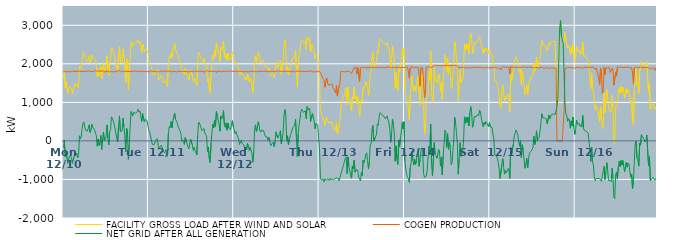
| Category | FACILITY GROSS LOAD AFTER WIND AND SOLAR | COGEN PRODUCTION | NET GRID AFTER ALL GENERATION |
|---|---|---|---|
|  Mon  12/10 | 1628 | 1807 | -179 |
|  Mon  12/10 | 1818 | 1796 | 22 |
|  Mon  12/10 | 1380 | 1792 | -412 |
|  Mon  12/10 | 1535 | 1798 | -263 |
|  Mon  12/10 | 1349 | 1794 | -445 |
|  Mon  12/10 | 1240 | 1818 | -578 |
|  Mon  12/10 | 1349 | 1804 | -455 |
|  Mon  12/10 | 1418 | 1812 | -394 |
|  Mon  12/10 | 1403 | 1790 | -387 |
|  Mon  12/10 | 1376 | 1804 | -428 |
|  Mon  12/10 | 1230 | 1812 | -582 |
|  Mon  12/10 | 1241 | 1806 | -565 |
|  Mon  12/10 | 1400 | 1801 | -401 |
|  Mon  12/10 | 1485 | 1807 | -322 |
|  Mon  12/10 | 1428 | 1800 | -372 |
|  Mon  12/10 | 1485 | 1802 | -317 |
|  Mon  12/10 | 1369 | 1812 | -443 |
|  Mon  12/10 | 1431 | 1811 | -380 |
|  Mon  12/10 | 1942 | 1809 | 133 |
|  Mon  12/10 | 1867 | 1814 | 53 |
|  Mon  12/10 | 1896 | 1800 | 96 |
|  Mon  12/10 | 2131 | 1810 | 321 |
|  Mon  12/10 | 2269 | 1806 | 463 |
|  Mon  12/10 | 2300 | 1807 | 493 |
|  Mon  12/10 | 2156 | 1799 | 357 |
|  Mon  12/10 | 2071 | 1798 | 273 |
|  Mon  12/10 | 2091 | 1812 | 279 |
|  Mon  12/10 | 2061 | 1805 | 256 |
|  Mon  12/10 | 2063 | 1812 | 251 |
|  Mon  12/10 | 2216 | 1799 | 417 |
|  Mon  12/10 | 2024 | 1806 | 218 |
|  Mon  12/10 | 2078 | 1810 | 268 |
|  Mon  12/10 | 2233 | 1805 | 428 |
|  Mon  12/10 | 2163 | 1809 | 354 |
|  Mon  12/10 | 2142 | 1796 | 346 |
|  Mon  12/10 | 2109 | 1823 | 286 |
|  Mon  12/10 | 2077 | 1807 | 270 |
|  Mon  12/10 | 1942 | 1811 | 131 |
|  Mon  12/10 | 1665 | 1801 | -136 |
|  Mon  12/10 | 1855 | 1807 | 48 |
|  Mon  12/10 | 1688 | 1802 | -114 |
|  Mon  12/10 | 1771 | 1827 | -56 |
|  Mon  12/10 | 1927 | 1787 | 140 |
|  Mon  12/10 | 1605 | 1826 | -221 |
|  Mon  12/10 | 1867 | 1803 | 64 |
|  Mon  12/10 | 2041 | 1809 | 232 |
|  Mon  12/10 | 1807 | 1803 | 4 |
|  Mon  12/10 | 1847 | 1787 | 60 |
|  Mon  12/10 | 1941 | 1818 | 123 |
|  Mon  12/10 | 2215 | 1801 | 414 |
|  Mon  12/10 | 1869 | 1801 | 68 |
|  Mon  12/10 | 1699 | 1804 | -105 |
|  Mon  12/10 | 2044 | 1790 | 254 |
|  Mon  12/10 | 2084 | 1795 | 289 |
|  Mon  12/10 | 2428 | 1804 | 624 |
|  Mon  12/10 | 2396 | 1808 | 588 |
|  Mon  12/10 | 2374 | 1788 | 586 |
|  Mon  12/10 | 2253 | 1809 | 444 |
|  Mon  12/10 | 2233 | 1801 | 432 |
|  Mon  12/10 | 1981 | 1792 | 189 |
|  Mon  12/10 | 1863 | 1810 | 53 |
|  Mon  12/10 | 1789 | 1811 | -22 |
|  Mon  12/10 | 2197 | 1820 | 377 |
|  Mon  12/10 | 2450 | 1801 | 649 |
|  Mon  12/10 | 2071 | 1821 | 250 |
|  Mon  12/10 | 2021 | 1794 | 227 |
|  Mon  12/10 | 2061 | 1804 | 257 |
|  Mon  12/10 | 2385 | 1794 | 591 |
|  Mon  12/10 | 2169 | 1809 | 360 |
|  Mon  12/10 | 1948 | 1808 | 140 |
|  Mon  12/10 | 1519 | 1798 | -279 |
|  Mon  12/10 | 2131 | 1805 | 326 |
|  Mon  12/10 | 2051 | 1795 | 256 |
|  Mon  12/10 | 1327 | 1805 | -478 |
|  Mon  12/10 | 1720 | 1820 | -100 |
|  Mon  12/10 | 2152 | 1798 | 354 |
|  Mon  12/10 | 2563 | 1802 | 761 |
|  Mon  12/10 | 2575 | 1805 | 770 |
|  Mon  12/10 | 2449 | 1799 | 650 |
|  Mon  12/10 | 2548 | 1804 | 744 |
|  Mon  12/10 | 2535 | 1793 | 742 |
|  Mon  12/10 | 2531 | 1818 | 713 |
|  Mon  12/10 | 2509 | 1800 | 709 |
|  Mon  12/10 | 2564 | 1803 | 761 |
|  Mon  12/10 | 2620 | 1798 | 822 |
|  Mon  12/10 | 2535 | 1789 | 746 |
|  Mon  12/10 | 2588 | 1811 | 777 |
|  Mon  12/10 | 2462 | 1805 | 657 |
|  Mon  12/10 | 2309 | 1805 | 504 |
|  Mon  12/10 | 2514 | 1808 | 706 |
|  Mon  12/10 | 2478 | 1797 | 681 |
|  Mon  12/10 | 2304 | 1807 | 497 |
|  Mon  12/10 | 2351 | 1794 | 557 |
|  Mon  12/10 | 2380 | 1798 | 582 |
|  Mon  12/10 | 2334 | 1809 | 525 |
|  Mon  12/10 | 2302 | 1800 | 502 |
|  Tue  12/11 | 2082 | 1809 | 273 |
|  Tue  12/11 | 2015 | 1785 | 230 |
|  Tue  12/11 | 1949 | 1821 | 128 |
|  Tue  12/11 | 1914 | 1804 | 110 |
|  Tue  12/11 | 1712 | 1802 | -90 |
|  Tue  12/11 | 1694 | 1802 | -108 |
|  Tue  12/11 | 1706 | 1802 | -96 |
|  Tue  12/11 | 1709 | 1796 | -87 |
|  Tue  12/11 | 1824 | 1812 | 12 |
|  Tue  12/11 | 1862 | 1803 | 59 |
|  Tue  12/11 | 1808 | 1792 | 16 |
|  Tue  12/11 | 1578 | 1803 | -225 |
|  Tue  12/11 | 1556 | 1796 | -240 |
|  Tue  12/11 | 1654 | 1796 | -142 |
|  Tue  12/11 | 1704 | 1815 | -111 |
|  Tue  12/11 | 1657 | 1820 | -163 |
|  Tue  12/11 | 1527 | 1800 | -273 |
|  Tue  12/11 | 1548 | 1810 | -262 |
|  Tue  12/11 | 1508 | 1813 | -305 |
|  Tue  12/11 | 1582 | 1809 | -227 |
|  Tue  12/11 | 1538 | 1812 | -274 |
|  Tue  12/11 | 1403 | 1802 | -399 |
|  Tue  12/11 | 1995 | 1811 | 184 |
|  Tue  12/11 | 2180 | 1803 | 377 |
|  Tue  12/11 | 2153 | 1813 | 340 |
|  Tue  12/11 | 2289 | 1787 | 502 |
|  Tue  12/11 | 2149 | 1812 | 337 |
|  Tue  12/11 | 2306 | 1800 | 506 |
|  Tue  12/11 | 2331 | 1813 | 518 |
|  Tue  12/11 | 2528 | 1804 | 724 |
|  Tue  12/11 | 2373 | 1815 | 558 |
|  Tue  12/11 | 2305 | 1789 | 516 |
|  Tue  12/11 | 2258 | 1802 | 456 |
|  Tue  12/11 | 2175 | 1801 | 374 |
|  Tue  12/11 | 2128 | 1806 | 322 |
|  Tue  12/11 | 2075 | 1813 | 262 |
|  Tue  12/11 | 1998 | 1796 | 202 |
|  Tue  12/11 | 1798 | 1801 | -3 |
|  Tue  12/11 | 1830 | 1801 | 29 |
|  Tue  12/11 | 1781 | 1800 | -19 |
|  Tue  12/11 | 1710 | 1801 | -91 |
|  Tue  12/11 | 1891 | 1805 | 86 |
|  Tue  12/11 | 1832 | 1812 | 20 |
|  Tue  12/11 | 1711 | 1798 | -87 |
|  Tue  12/11 | 1731 | 1805 | -74 |
|  Tue  12/11 | 1582 | 1790 | -208 |
|  Tue  12/11 | 1730 | 1810 | -80 |
|  Tue  12/11 | 1841 | 1799 | 42 |
|  Tue  12/11 | 1851 | 1797 | 54 |
|  Tue  12/11 | 1694 | 1804 | -110 |
|  Tue  12/11 | 1557 | 1802 | -245 |
|  Tue  12/11 | 1630 | 1793 | -163 |
|  Tue  12/11 | 1553 | 1804 | -251 |
|  Tue  12/11 | 1552 | 1821 | -269 |
|  Tue  12/11 | 1438 | 1801 | -363 |
|  Tue  12/11 | 1948 | 1801 | 147 |
|  Tue  12/11 | 2297 | 1807 | 490 |
|  Tue  12/11 | 2267 | 1806 | 461 |
|  Tue  12/11 | 2276 | 1808 | 468 |
|  Tue  12/11 | 2128 | 1810 | 318 |
|  Tue  12/11 | 2072 | 1811 | 261 |
|  Tue  12/11 | 2039 | 1803 | 236 |
|  Tue  12/11 | 2135 | 1810 | 325 |
|  Tue  12/11 | 1987 | 1783 | 204 |
|  Tue  12/11 | 1970 | 1783 | 187 |
|  Tue  12/11 | 1944 | 1823 | 121 |
|  Tue  12/11 | 1530 | 1805 | -275 |
|  Tue  12/11 | 1644 | 1808 | -164 |
|  Tue  12/11 | 1338 | 1803 | -465 |
|  Tue  12/11 | 1244 | 1806 | -562 |
|  Tue  12/11 | 1739 | 1800 | -61 |
|  Tue  12/11 | 2026 | 1806 | 220 |
|  Tue  12/11 | 2223 | 1790 | 433 |
|  Tue  12/11 | 2140 | 1802 | 338 |
|  Tue  12/11 | 2353 | 1810 | 543 |
|  Tue  12/11 | 2180 | 1805 | 375 |
|  Tue  12/11 | 2539 | 1774 | 765 |
|  Tue  12/11 | 2467 | 1816 | 651 |
|  Tue  12/11 | 2446 | 1813 | 633 |
|  Tue  12/11 | 2235 | 1802 | 433 |
|  Tue  12/11 | 2053 | 1802 | 251 |
|  Tue  12/11 | 2438 | 1796 | 642 |
|  Tue  12/11 | 2369 | 1799 | 570 |
|  Tue  12/11 | 2439 | 1799 | 640 |
|  Tue  12/11 | 2582 | 1796 | 786 |
|  Tue  12/11 | 2220 | 1811 | 409 |
|  Tue  12/11 | 2147 | 1798 | 349 |
|  Tue  12/11 | 2261 | 1793 | 468 |
|  Tue  12/11 | 2088 | 1810 | 278 |
|  Tue  12/11 | 2275 | 1811 | 464 |
|  Tue  12/11 | 2132 | 1798 | 334 |
|  Tue  12/11 | 2144 | 1813 | 331 |
|  Tue  12/11 | 2098 | 1801 | 297 |
|  Tue  12/11 | 2257 | 1807 | 450 |
|  Tue  12/11 | 2316 | 1793 | 523 |
|  Tue  12/11 | 2176 | 1803 | 373 |
|  Wed  12/12 | 2155 | 1798 | 357 |
|  Wed  12/12 | 1996 | 1809 | 187 |
|  Wed  12/12 | 2043 | 1801 | 242 |
|  Wed  12/12 | 1976 | 1806 | 170 |
|  Wed  12/12 | 1949 | 1802 | 147 |
|  Wed  12/12 | 1867 | 1812 | 55 |
|  Wed  12/12 | 1701 | 1797 | -96 |
|  Wed  12/12 | 1730 | 1802 | -72 |
|  Wed  12/12 | 1823 | 1807 | 16 |
|  Wed  12/12 | 1731 | 1798 | -67 |
|  Wed  12/12 | 1712 | 1802 | -90 |
|  Wed  12/12 | 1687 | 1790 | -103 |
|  Wed  12/12 | 1583 | 1806 | -223 |
|  Wed  12/12 | 1651 | 1807 | -156 |
|  Wed  12/12 | 1575 | 1807 | -232 |
|  Wed  12/12 | 1723 | 1794 | -71 |
|  Wed  12/12 | 1654 | 1796 | -142 |
|  Wed  12/12 | 1538 | 1792 | -254 |
|  Wed  12/12 | 1638 | 1801 | -163 |
|  Wed  12/12 | 1637 | 1808 | -171 |
|  Wed  12/12 | 1482 | 1801 | -319 |
|  Wed  12/12 | 1252 | 1806 | -554 |
|  Wed  12/12 | 1530 | 1802 | -272 |
|  Wed  12/12 | 2115 | 1800 | 315 |
|  Wed  12/12 | 2215 | 1799 | 416 |
|  Wed  12/12 | 2040 | 1793 | 247 |
|  Wed  12/12 | 2110 | 1789 | 321 |
|  Wed  12/12 | 2294 | 1798 | 496 |
|  Wed  12/12 | 2233 | 1819 | 414 |
|  Wed  12/12 | 2067 | 1813 | 254 |
|  Wed  12/12 | 2033 | 1807 | 226 |
|  Wed  12/12 | 2082 | 1804 | 278 |
|  Wed  12/12 | 2109 | 1806 | 303 |
|  Wed  12/12 | 2072 | 1803 | 269 |
|  Wed  12/12 | 1999 | 1803 | 196 |
|  Wed  12/12 | 1921 | 1805 | 116 |
|  Wed  12/12 | 1921 | 1798 | 123 |
|  Wed  12/12 | 1912 | 1812 | 100 |
|  Wed  12/12 | 1843 | 1824 | 19 |
|  Wed  12/12 | 1892 | 1795 | 97 |
|  Wed  12/12 | 1813 | 1813 | 0 |
|  Wed  12/12 | 1680 | 1804 | -124 |
|  Wed  12/12 | 1684 | 1805 | -121 |
|  Wed  12/12 | 1751 | 1812 | -61 |
|  Wed  12/12 | 1770 | 1805 | -35 |
|  Wed  12/12 | 1642 | 1793 | -151 |
|  Wed  12/12 | 1783 | 1801 | -18 |
|  Wed  12/12 | 2051 | 1815 | 236 |
|  Wed  12/12 | 2061 | 1800 | 261 |
|  Wed  12/12 | 1884 | 1806 | 78 |
|  Wed  12/12 | 1871 | 1809 | 62 |
|  Wed  12/12 | 1988 | 1814 | 174 |
|  Wed  12/12 | 2082 | 1818 | 264 |
|  Wed  12/12 | 1727 | 1798 | -71 |
|  Wed  12/12 | 1877 | 1817 | 60 |
|  Wed  12/12 | 2025 | 1811 | 214 |
|  Wed  12/12 | 2442 | 1794 | 648 |
|  Wed  12/12 | 2619 | 1808 | 811 |
|  Wed  12/12 | 2483 | 1806 | 677 |
|  Wed  12/12 | 1817 | 1810 | 7 |
|  Wed  12/12 | 1918 | 1785 | 133 |
|  Wed  12/12 | 1709 | 1806 | -97 |
|  Wed  12/12 | 1836 | 1806 | 30 |
|  Wed  12/12 | 1825 | 1807 | 18 |
|  Wed  12/12 | 2001 | 1805 | 196 |
|  Wed  12/12 | 1978 | 1790 | 188 |
|  Wed  12/12 | 2155 | 1800 | 355 |
|  Wed  12/12 | 2152 | 1814 | 338 |
|  Wed  12/12 | 2213 | 1806 | 407 |
|  Wed  12/12 | 2349 | 1790 | 559 |
|  Wed  12/12 | 1879 | 1785 | 94 |
|  Wed  12/12 | 1408 | 1816 | -408 |
|  Wed  12/12 | 1984 | 1810 | 174 |
|  Wed  12/12 | 2215 | 1804 | 411 |
|  Wed  12/12 | 2355 | 1796 | 559 |
|  Wed  12/12 | 2571 | 1811 | 760 |
|  Wed  12/12 | 2633 | 1809 | 824 |
|  Wed  12/12 | 2601 | 1801 | 800 |
|  Wed  12/12 | 2551 | 1813 | 738 |
|  Wed  12/12 | 2567 | 1807 | 760 |
|  Wed  12/12 | 2586 | 1804 | 782 |
|  Wed  12/12 | 2378 | 1798 | 580 |
|  Wed  12/12 | 2695 | 1803 | 892 |
|  Wed  12/12 | 2661 | 1809 | 852 |
|  Wed  12/12 | 2601 | 1801 | 800 |
|  Wed  12/12 | 2649 | 1808 | 841 |
|  Wed  12/12 | 2315 | 1811 | 504 |
|  Wed  12/12 | 2462 | 1819 | 643 |
|  Wed  12/12 | 2497 | 1785 | 712 |
|  Wed  12/12 | 2377 | 1780 | 597 |
|  Wed  12/12 | 2308 | 1794 | 514 |
|  Wed  12/12 | 2123 | 1806 | 317 |
|  Wed  12/12 | 2241 | 1790 | 451 |
|  Wed  12/12 | 2218 | 1792 | 426 |
|  Wed  12/12 | 2221 | 1809 | 412 |
|  Wed  12/12 | 1866 | 1807 | 59 |
|  Thu  12/13 | 1581 | 1798 | -217 |
|  Thu  12/13 | 804 | 1763 | -959 |
|  Thu  12/13 | 723 | 1739 | -1016 |
|  Thu  12/13 | 650 | 1655 | -1005 |
|  Thu  12/13 | 644 | 1630 | -986 |
|  Thu  12/13 | 525 | 1589 | -1064 |
|  Thu  12/13 | 405 | 1391 | -986 |
|  Thu  12/13 | 529 | 1518 | -989 |
|  Thu  12/13 | 613 | 1634 | -1021 |
|  Thu  12/13 | 528 | 1509 | -981 |
|  Thu  12/13 | 466 | 1449 | -983 |
|  Thu  12/13 | 443 | 1469 | -1026 |
|  Thu  12/13 | 494 | 1460 | -966 |
|  Thu  12/13 | 448 | 1460 | -1012 |
|  Thu  12/13 | 495 | 1478 | -983 |
|  Thu  12/13 | 387 | 1390 | -1003 |
|  Thu  12/13 | 328 | 1343 | -1015 |
|  Thu  12/13 | 340 | 1321 | -981 |
|  Thu  12/13 | 264 | 1241 | -977 |
|  Thu  12/13 | 478 | 1442 | -964 |
|  Thu  12/13 | 182 | 1164 | -982 |
|  Thu  12/13 | 178 | 1152 | -974 |
|  Thu  12/13 | 391 | 1427 | -1036 |
|  Thu  12/13 | 546 | 1497 | -951 |
|  Thu  12/13 | 853 | 1803 | -950 |
|  Thu  12/13 | 1037 | 1810 | -773 |
|  Thu  12/13 | 1034 | 1802 | -768 |
|  Thu  12/13 | 1186 | 1808 | -622 |
|  Thu  12/13 | 1155 | 1789 | -634 |
|  Thu  12/13 | 1360 | 1798 | -438 |
|  Thu  12/13 | 1389 | 1799 | -410 |
|  Thu  12/13 | 951 | 1799 | -848 |
|  Thu  12/13 | 1392 | 1807 | -415 |
|  Thu  12/13 | 1150 | 1814 | -664 |
|  Thu  12/13 | 1128 | 1802 | -674 |
|  Thu  12/13 | 904 | 1809 | -905 |
|  Thu  12/13 | 782 | 1750 | -968 |
|  Thu  12/13 | 1148 | 1798 | -650 |
|  Thu  12/13 | 1097 | 1811 | -714 |
|  Thu  12/13 | 1405 | 1904 | -499 |
|  Thu  12/13 | 1090 | 1901 | -811 |
|  Thu  12/13 | 1166 | 1918 | -752 |
|  Thu  12/13 | 973 | 1737 | -764 |
|  Thu  12/13 | 1147 | 1903 | -756 |
|  Thu  12/13 | 958 | 1896 | -938 |
|  Thu  12/13 | 619 | 1543 | -924 |
|  Thu  12/13 | 858 | 1895 | -1037 |
|  Thu  12/13 | 1085 | 1905 | -820 |
|  Thu  12/13 | 1018 | 1916 | -898 |
|  Thu  12/13 | 1391 | 1898 | -507 |
|  Thu  12/13 | 1340 | 1902 | -562 |
|  Thu  12/13 | 1429 | 1905 | -476 |
|  Thu  12/13 | 1546 | 1907 | -361 |
|  Thu  12/13 | 1566 | 1876 | -310 |
|  Thu  12/13 | 1408 | 1921 | -513 |
|  Thu  12/13 | 1176 | 1907 | -731 |
|  Thu  12/13 | 1342 | 1891 | -549 |
|  Thu  12/13 | 1779 | 1887 | -108 |
|  Thu  12/13 | 1834 | 1914 | -80 |
|  Thu  12/13 | 2217 | 1907 | 310 |
|  Thu  12/13 | 2308 | 1907 | 401 |
|  Thu  12/13 | 1905 | 1908 | -3 |
|  Thu  12/13 | 1893 | 1908 | -15 |
|  Thu  12/13 | 2005 | 1893 | 112 |
|  Thu  12/13 | 2070 | 1912 | 158 |
|  Thu  12/13 | 2342 | 1900 | 442 |
|  Thu  12/13 | 2287 | 1888 | 399 |
|  Thu  12/13 | 2535 | 1911 | 624 |
|  Thu  12/13 | 2643 | 1913 | 730 |
|  Thu  12/13 | 2605 | 1897 | 708 |
|  Thu  12/13 | 2583 | 1890 | 693 |
|  Thu  12/13 | 2570 | 1916 | 654 |
|  Thu  12/13 | 2564 | 1911 | 653 |
|  Thu  12/13 | 2524 | 1896 | 628 |
|  Thu  12/13 | 2477 | 1906 | 571 |
|  Thu  12/13 | 2492 | 1909 | 583 |
|  Thu  12/13 | 2551 | 1904 | 647 |
|  Thu  12/13 | 2458 | 1915 | 543 |
|  Thu  12/13 | 2403 | 1922 | 481 |
|  Thu  12/13 | 2223 | 1918 | 305 |
|  Thu  12/13 | 1859 | 1897 | -38 |
|  Thu  12/13 | 2071 | 1897 | 174 |
|  Thu  12/13 | 2466 | 1896 | 570 |
|  Thu  12/13 | 2333 | 1906 | 427 |
|  Thu  12/13 | 2127 | 1904 | 223 |
|  Thu  12/13 | 1384 | 1911 | -527 |
|  Thu  12/13 | 1781 | 1910 | -129 |
|  Thu  12/13 | 1404 | 1887 | -483 |
|  Thu  12/13 | 1309 | 1920 | -611 |
|  Thu  12/13 | 1917 | 1893 | 24 |
|  Thu  12/13 | 1764 | 1915 | -151 |
|  Thu  12/13 | 1984 | 1902 | 82 |
|  Thu  12/13 | 2127 | 1894 | 233 |
|  Thu  12/13 | 2385 | 1907 | 478 |
|  Thu  12/13 | 2223 | 1913 | 310 |
|  Thu  12/13 | 2398 | 1900 | 498 |
|  Fri  12/14 | 1374 | 1911 | -537 |
|  Fri  12/14 | 1184 | 1923 | -739 |
|  Fri  12/14 | 1035 | 1910 | -875 |
|  Fri  12/14 | 989 | 1921 | -932 |
|  Fri  12/14 | 965 | 1906 | -941 |
|  Fri  12/14 | 551 | 1625 | -1074 |
|  Fri  12/14 | 1197 | 1897 | -700 |
|  Fri  12/14 | 1342 | 1902 | -560 |
|  Fri  12/14 | 1678 | 1937 | -259 |
|  Fri  12/14 | 1384 | 1895 | -511 |
|  Fri  12/14 | 1291 | 1908 | -617 |
|  Fri  12/14 | 1424 | 1902 | -478 |
|  Fri  12/14 | 1290 | 1898 | -608 |
|  Fri  12/14 | 1401 | 1908 | -507 |
|  Fri  12/14 | 1599 | 1902 | -303 |
|  Fri  12/14 | 1708 | 1909 | -201 |
|  Fri  12/14 | 1246 | 1903 | -657 |
|  Fri  12/14 | 939 | 1421 | -482 |
|  Fri  12/14 | 1650 | 1899 | -249 |
|  Fri  12/14 | 1730 | 1914 | -184 |
|  Fri  12/14 | 1605 | 1898 | -293 |
|  Fri  12/14 | 1069 | 1916 | -847 |
|  Fri  12/14 | 167 | 1117 | -950 |
|  Fri  12/14 | 384 | 1339 | -955 |
|  Fri  12/14 | 1001 | 1916 | -915 |
|  Fri  12/14 | 1133 | 1891 | -758 |
|  Fri  12/14 | 1163 | 1919 | -756 |
|  Fri  12/14 | 1778 | 1919 | -141 |
|  Fri  12/14 | 1566 | 1923 | -357 |
|  Fri  12/14 | 2336 | 1903 | 433 |
|  Fri  12/14 | 1283 | 1891 | -608 |
|  Fri  12/14 | 999 | 1912 | -913 |
|  Fri  12/14 | 1047 | 1942 | -895 |
|  Fri  12/14 | 1905 | 1951 | -46 |
|  Fri  12/14 | 1620 | 1961 | -341 |
|  Fri  12/14 | 1569 | 1944 | -375 |
|  Fri  12/14 | 1501 | 1951 | -450 |
|  Fri  12/14 | 1622 | 1968 | -346 |
|  Fri  12/14 | 1733 | 1956 | -223 |
|  Fri  12/14 | 1621 | 1945 | -324 |
|  Fri  12/14 | 1295 | 1948 | -653 |
|  Fri  12/14 | 1518 | 1941 | -423 |
|  Fri  12/14 | 1074 | 1948 | -874 |
|  Fri  12/14 | 1557 | 1957 | -400 |
|  Fri  12/14 | 1854 | 1956 | -102 |
|  Fri  12/14 | 2233 | 1960 | 273 |
|  Fri  12/14 | 2185 | 1962 | 223 |
|  Fri  12/14 | 1781 | 1950 | -169 |
|  Fri  12/14 | 2136 | 1950 | 186 |
|  Fri  12/14 | 1729 | 1949 | -220 |
|  Fri  12/14 | 1920 | 1951 | -31 |
|  Fri  12/14 | 1808 | 1959 | -151 |
|  Fri  12/14 | 1350 | 1963 | -613 |
|  Fri  12/14 | 1386 | 1962 | -576 |
|  Fri  12/14 | 1719 | 1957 | -238 |
|  Fri  12/14 | 1997 | 1956 | 41 |
|  Fri  12/14 | 2573 | 1959 | 614 |
|  Fri  12/14 | 2420 | 1959 | 461 |
|  Fri  12/14 | 2161 | 1960 | 201 |
|  Fri  12/14 | 1870 | 1943 | -73 |
|  Fri  12/14 | 1039 | 1901 | -862 |
|  Fri  12/14 | 1433 | 1907 | -474 |
|  Fri  12/14 | 1850 | 1895 | -45 |
|  Fri  12/14 | 1505 | 1903 | -398 |
|  Fri  12/14 | 1508 | 1911 | -403 |
|  Fri  12/14 | 1625 | 1905 | -280 |
|  Fri  12/14 | 1949 | 1905 | 44 |
|  Fri  12/14 | 2523 | 1899 | 624 |
|  Fri  12/14 | 2352 | 1896 | 456 |
|  Fri  12/14 | 2514 | 1904 | 610 |
|  Fri  12/14 | 2379 | 1899 | 480 |
|  Fri  12/14 | 2517 | 1904 | 613 |
|  Fri  12/14 | 2277 | 1888 | 389 |
|  Fri  12/14 | 2633 | 1905 | 728 |
|  Fri  12/14 | 2784 | 1894 | 890 |
|  Fri  12/14 | 2655 | 1911 | 744 |
|  Fri  12/14 | 2261 | 1908 | 353 |
|  Fri  12/14 | 2291 | 1894 | 397 |
|  Fri  12/14 | 2544 | 1909 | 635 |
|  Fri  12/14 | 2538 | 1910 | 628 |
|  Fri  12/14 | 2529 | 1907 | 622 |
|  Fri  12/14 | 2556 | 1924 | 632 |
|  Fri  12/14 | 2595 | 1902 | 693 |
|  Fri  12/14 | 2581 | 1919 | 662 |
|  Fri  12/14 | 2704 | 1915 | 789 |
|  Fri  12/14 | 2610 | 1893 | 717 |
|  Fri  12/14 | 2490 | 1901 | 589 |
|  Fri  12/14 | 2372 | 1910 | 462 |
|  Fri  12/14 | 2269 | 1898 | 371 |
|  Fri  12/14 | 2387 | 1911 | 476 |
|  Fri  12/14 | 2306 | 1888 | 418 |
|  Fri  12/14 | 2407 | 1902 | 505 |
|  Fri  12/14 | 2374 | 1909 | 465 |
|  Fri  12/14 | 2380 | 1892 | 488 |
|  Fri  12/14 | 2267 | 1897 | 370 |
|  Fri  12/14 | 2387 | 1912 | 475 |
|  Sat  12/15 | 2257 | 1893 | 364 |
|  Sat  12/15 | 2274 | 1908 | 366 |
|  Sat  12/15 | 2247 | 1897 | 350 |
|  Sat  12/15 | 2072 | 1903 | 169 |
|  Sat  12/15 | 1982 | 1914 | 68 |
|  Sat  12/15 | 1529 | 1895 | -366 |
|  Sat  12/15 | 1558 | 1907 | -349 |
|  Sat  12/15 | 1531 | 1912 | -381 |
|  Sat  12/15 | 1433 | 1889 | -456 |
|  Sat  12/15 | 1340 | 1896 | -556 |
|  Sat  12/15 | 1161 | 1897 | -736 |
|  Sat  12/15 | 910 | 1884 | -974 |
|  Sat  12/15 | 859 | 1843 | -984 |
|  Sat  12/15 | 1286 | 1908 | -622 |
|  Sat  12/15 | 1453 | 1914 | -461 |
|  Sat  12/15 | 1263 | 1924 | -661 |
|  Sat  12/15 | 1039 | 1900 | -861 |
|  Sat  12/15 | 1143 | 1908 | -765 |
|  Sat  12/15 | 1068 | 1893 | -825 |
|  Sat  12/15 | 1132 | 1911 | -779 |
|  Sat  12/15 | 1202 | 1918 | -716 |
|  Sat  12/15 | 1135 | 1911 | -776 |
|  Sat  12/15 | 765 | 1738 | -973 |
|  Sat  12/15 | 1754 | 1925 | -171 |
|  Sat  12/15 | 1547 | 1902 | -355 |
|  Sat  12/15 | 1567 | 1920 | -353 |
|  Sat  12/15 | 1827 | 1903 | -76 |
|  Sat  12/15 | 2035 | 1906 | 129 |
|  Sat  12/15 | 2107 | 1903 | 204 |
|  Sat  12/15 | 2193 | 1908 | 285 |
|  Sat  12/15 | 2121 | 1904 | 217 |
|  Sat  12/15 | 2068 | 1910 | 158 |
|  Sat  12/15 | 1889 | 1906 | -17 |
|  Sat  12/15 | 1764 | 1901 | -137 |
|  Sat  12/15 | 1906 | 1901 | 5 |
|  Sat  12/15 | 1466 | 1903 | -437 |
|  Sat  12/15 | 1807 | 1909 | -102 |
|  Sat  12/15 | 1666 | 1913 | -247 |
|  Sat  12/15 | 1421 | 1891 | -470 |
|  Sat  12/15 | 1213 | 1923 | -710 |
|  Sat  12/15 | 1303 | 1905 | -602 |
|  Sat  12/15 | 1459 | 1906 | -447 |
|  Sat  12/15 | 1191 | 1893 | -702 |
|  Sat  12/15 | 1424 | 1904 | -480 |
|  Sat  12/15 | 1563 | 1891 | -328 |
|  Sat  12/15 | 1626 | 1918 | -292 |
|  Sat  12/15 | 1600 | 1910 | -310 |
|  Sat  12/15 | 1672 | 1903 | -231 |
|  Sat  12/15 | 1733 | 1902 | -169 |
|  Sat  12/15 | 2017 | 1893 | 124 |
|  Sat  12/15 | 1818 | 1914 | -96 |
|  Sat  12/15 | 1920 | 1905 | 15 |
|  Sat  12/15 | 2179 | 1915 | 264 |
|  Sat  12/15 | 1912 | 1905 | 7 |
|  Sat  12/15 | 1962 | 1906 | 56 |
|  Sat  12/15 | 1965 | 1875 | 90 |
|  Sat  12/15 | 2178 | 1917 | 261 |
|  Sat  12/15 | 2162 | 1914 | 248 |
|  Sat  12/15 | 2611 | 1907 | 704 |
|  Sat  12/15 | 2499 | 1900 | 599 |
|  Sat  12/15 | 2500 | 1885 | 615 |
|  Sat  12/15 | 2501 | 1904 | 597 |
|  Sat  12/15 | 2465 | 1893 | 572 |
|  Sat  12/15 | 2467 | 1903 | 564 |
|  Sat  12/15 | 2341 | 1899 | 442 |
|  Sat  12/15 | 2364 | 1916 | 448 |
|  Sat  12/15 | 2550 | 1881 | 669 |
|  Sat  12/15 | 2479 | 1904 | 575 |
|  Sat  12/15 | 2538 | 1898 | 640 |
|  Sat  12/15 | 2580 | 1889 | 691 |
|  Sat  12/15 | 2580 | 1889 | 691 |
|  Sat  12/15 | 2580 | 1889 | 691 |
|  Sat  12/15 | 2580 | 1889 | 691 |
|  Sat  12/15 | 2580 | 1889 | 691 |
|  Sat  12/15 | 2580 | 1889 | 691 |
|  Sat  12/15 | 876 | 0 | 876 |
|  Sat  12/15 | 1107 | 0 | 1107 |
|  Sat  12/15 | 2027 | 0 | 2027 |
|  Sat  12/15 | 2901 | 0 | 2901 |
|  Sat  12/15 | 3121 | 0 | 3121 |
|  Sat  12/15 | 2728 | 0 | 2728 |
|  Sat  12/15 | 2744 | 0 | 2744 |
|  Sat  12/15 | 2540 | 16 | 2524 |
|  Sat  12/15 | 2511 | 765 | 1746 |
|  Sat  12/15 | 2811 | 1857 | 954 |
|  Sat  12/15 | 2609 | 1892 | 717 |
|  Sat  12/15 | 2566 | 1911 | 655 |
|  Sat  12/15 | 2416 | 1904 | 512 |
|  Sat  12/15 | 2487 | 1912 | 575 |
|  Sat  12/15 | 2448 | 1909 | 539 |
|  Sat  12/15 | 2243 | 1915 | 328 |
|  Sat  12/15 | 2421 | 1900 | 521 |
|  Sat  12/15 | 2282 | 1897 | 385 |
|  Sat  12/15 | 2511 | 1891 | 620 |
|  Sat  12/15 | 2263 | 1905 | 358 |
|  Sat  12/15 | 2058 | 1888 | 170 |
|  Sun  12/16 | 2179 | 1891 | 288 |
|  Sun  12/16 | 2448 | 1907 | 541 |
|  Sun  12/16 | 2340 | 1908 | 432 |
|  Sun  12/16 | 2338 | 1910 | 428 |
|  Sun  12/16 | 2357 | 1906 | 451 |
|  Sun  12/16 | 2272 | 1895 | 377 |
|  Sun  12/16 | 2323 | 1908 | 415 |
|  Sun  12/16 | 2261 | 1895 | 366 |
|  Sun  12/16 | 2567 | 1911 | 656 |
|  Sun  12/16 | 2206 | 1892 | 314 |
|  Sun  12/16 | 2181 | 1910 | 271 |
|  Sun  12/16 | 2209 | 1917 | 292 |
|  Sun  12/16 | 2155 | 1905 | 250 |
|  Sun  12/16 | 2142 | 1903 | 239 |
|  Sun  12/16 | 2100 | 1897 | 203 |
|  Sun  12/16 | 1938 | 1922 | 16 |
|  Sun  12/16 | 1666 | 1893 | -227 |
|  Sun  12/16 | 1355 | 1886 | -531 |
|  Sun  12/16 | 1756 | 1913 | -157 |
|  Sun  12/16 | 1338 | 1901 | -563 |
|  Sun  12/16 | 1307 | 1913 | -606 |
|  Sun  12/16 | 974 | 1908 | -934 |
|  Sun  12/16 | 822 | 1855 | -1033 |
|  Sun  12/16 | 919 | 1896 | -977 |
|  Sun  12/16 | 848 | 1818 | -970 |
|  Sun  12/16 | 867 | 1841 | -974 |
|  Sun  12/16 | 653 | 1612 | -959 |
|  Sun  12/16 | 486 | 1465 | -979 |
|  Sun  12/16 | 893 | 1892 | -999 |
|  Sun  12/16 | 753 | 1800 | -1047 |
|  Sun  12/16 | 311 | 1232 | -921 |
|  Sun  12/16 | 390 | 1314 | -924 |
|  Sun  12/16 | 1248 | 1910 | -662 |
|  Sun  12/16 | 723 | 1725 | -1002 |
|  Sun  12/16 | 1081 | 1893 | -812 |
|  Sun  12/16 | 1339 | 1901 | -562 |
|  Sun  12/16 | 1143 | 1908 | -765 |
|  Sun  12/16 | 868 | 1895 | -1027 |
|  Sun  12/16 | 886 | 1896 | -1010 |
|  Sun  12/16 | 746 | 1775 | -1029 |
|  Sun  12/16 | 781 | 1837 | -1056 |
|  Sun  12/16 | 1184 | 1894 | -710 |
|  Sun  12/16 | 882 | 1838 | -956 |
|  Sun  12/16 | -26 | 1446 | -1472 |
|  Sun  12/16 | -68 | 1433 | -1501 |
|  Sun  12/16 | 904 | 1776 | -872 |
|  Sun  12/16 | 874 | 1687 | -813 |
|  Sun  12/16 | 927 | 1919 | -992 |
|  Sun  12/16 | 1249 | 1915 | -666 |
|  Sun  12/16 | 1377 | 1905 | -528 |
|  Sun  12/16 | 1240 | 1911 | -671 |
|  Sun  12/16 | 1411 | 1919 | -508 |
|  Sun  12/16 | 1276 | 1905 | -629 |
|  Sun  12/16 | 1395 | 1902 | -507 |
|  Sun  12/16 | 1246 | 1897 | -651 |
|  Sun  12/16 | 1109 | 1908 | -799 |
|  Sun  12/16 | 1104 | 1902 | -798 |
|  Sun  12/16 | 1353 | 1909 | -556 |
|  Sun  12/16 | 1219 | 1899 | -680 |
|  Sun  12/16 | 1347 | 1922 | -575 |
|  Sun  12/16 | 1284 | 1902 | -618 |
|  Sun  12/16 | 1116 | 1894 | -778 |
|  Sun  12/16 | 962 | 1901 | -939 |
|  Sun  12/16 | 1038 | 1899 | -861 |
|  Sun  12/16 | 524 | 1764 | -1240 |
|  Sun  12/16 | 418 | 1472 | -1054 |
|  Sun  12/16 | 1335 | 1889 | -554 |
|  Sun  12/16 | 1841 | 1919 | -78 |
|  Sun  12/16 | 1891 | 1901 | -10 |
|  Sun  12/16 | 1456 | 1903 | -447 |
|  Sun  12/16 | 1415 | 1914 | -499 |
|  Sun  12/16 | 1237 | 1891 | -654 |
|  Sun  12/16 | 1855 | 1915 | -60 |
|  Sun  12/16 | 1818 | 1928 | -110 |
|  Sun  12/16 | 2059 | 1898 | 161 |
|  Sun  12/16 | 2020 | 1905 | 115 |
|  Sun  12/16 | 2038 | 1912 | 126 |
|  Sun  12/16 | 1948 | 1907 | 41 |
|  Sun  12/16 | 1876 | 1900 | -24 |
|  Sun  12/16 | 1917 | 1915 | 2 |
|  Sun  12/16 | 2057 | 1903 | 154 |
|  Sun  12/16 | 2054 | 1906 | 148 |
|  Sun  12/16 | 1261 | 1902 | -641 |
|  Sun  12/16 | 1487 | 1893 | -406 |
|  Sun  12/16 | 821 | 1855 | -1034 |
|  Sun  12/16 | 848 | 1863 | -1015 |
|  Sun  12/16 | 927 | 1900 | -973 |
|  Sun  12/16 | 964 | 1911 | -947 |
|  Sun  12/16 | 944 | 1888 | -944 |
|  Sun  12/16 | 818 | 1835 | -1017 |
|  Sun  12/16 | 869 | 1892 | -1023 |
|  Sun  12/16 | 821 | 1778 | -957 |